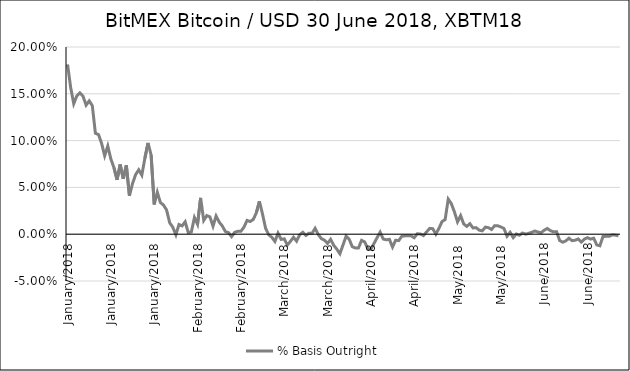
| Category | % Basis Outright |
|---|---|
| 2018-06-30 | -0.002 |
| 2018-06-29 | -0.001 |
| 2018-06-28 | -0.001 |
| 2018-06-27 | -0.002 |
| 2018-06-26 | -0.002 |
| 2018-06-25 | -0.002 |
| 2018-06-24 | -0.012 |
| 2018-06-23 | -0.012 |
| 2018-06-22 | -0.004 |
| 2018-06-21 | -0.005 |
| 2018-06-20 | -0.004 |
| 2018-06-19 | -0.005 |
| 2018-06-18 | -0.008 |
| 2018-06-17 | -0.005 |
| 2018-06-16 | -0.006 |
| 2018-06-15 | -0.007 |
| 2018-06-14 | -0.004 |
| 2018-06-13 | -0.007 |
| 2018-06-12 | -0.009 |
| 2018-06-11 | -0.007 |
| 2018-06-10 | 0.003 |
| 2018-06-09 | 0.002 |
| 2018-06-08 | 0.004 |
| 2018-06-07 | 0.006 |
| 2018-06-06 | 0.004 |
| 2018-06-05 | 0.002 |
| 2018-06-04 | 0.002 |
| 2018-06-03 | 0.003 |
| 2018-06-02 | 0.002 |
| 2018-06-01 | 0.001 |
| 2018-05-31 | 0 |
| 2018-05-30 | 0.001 |
| 2018-05-29 | -0.001 |
| 2018-05-28 | 0 |
| 2018-05-27 | -0.004 |
| 2018-05-26 | 0.002 |
| 2018-05-25 | -0.002 |
| 2018-05-24 | 0.006 |
| 2018-05-23 | 0.008 |
| 2018-05-22 | 0.009 |
| 2018-05-21 | 0.009 |
| 2018-05-20 | 0.005 |
| 2018-05-19 | 0.007 |
| 2018-05-18 | 0.008 |
| 2018-05-17 | 0.004 |
| 2018-05-16 | 0.004 |
| 2018-05-15 | 0.007 |
| 2018-05-14 | 0.007 |
| 2018-05-13 | 0.011 |
| 2018-05-12 | 0.008 |
| 2018-05-11 | 0.011 |
| 2018-05-10 | 0.02 |
| 2018-05-09 | 0.013 |
| 2018-05-08 | 0.024 |
| 2018-05-07 | 0.033 |
| 2018-05-06 | 0.037 |
| 2018-05-05 | 0.016 |
| 2018-05-04 | 0.014 |
| 2018-05-03 | 0.006 |
| 2018-05-02 | 0 |
| 2018-05-01 | 0.006 |
| 2018-04-30 | 0.006 |
| 2018-04-29 | 0.002 |
| 2018-04-28 | -0.001 |
| 2018-04-27 | 0 |
| 2018-04-26 | 0 |
| 2018-04-25 | -0.004 |
| 2018-04-24 | -0.002 |
| 2018-04-23 | -0.002 |
| 2018-04-22 | -0.002 |
| 2018-04-21 | -0.002 |
| 2018-04-20 | -0.007 |
| 2018-04-19 | -0.006 |
| 2018-04-18 | -0.014 |
| 2018-04-17 | -0.006 |
| 2018-04-16 | -0.006 |
| 2018-04-15 | -0.005 |
| 2018-04-14 | 0.002 |
| 2018-04-13 | -0.004 |
| 2018-04-12 | -0.01 |
| 2018-04-11 | -0.016 |
| 2018-04-10 | -0.015 |
| 2018-04-09 | -0.008 |
| 2018-04-08 | -0.007 |
| 2018-04-07 | -0.015 |
| 2018-04-06 | -0.015 |
| 2018-04-05 | -0.013 |
| 2018-04-04 | -0.005 |
| 2018-04-03 | -0.002 |
| 2018-04-02 | -0.012 |
| 2018-04-01 | -0.021 |
| 2018-03-31 | -0.016 |
| 2018-03-30 | -0.012 |
| 2018-03-29 | -0.005 |
| 2018-03-28 | -0.01 |
| 2018-03-27 | -0.006 |
| 2018-03-26 | -0.005 |
| 2018-03-25 | 0 |
| 2018-03-24 | 0.006 |
| 2018-03-23 | 0.001 |
| 2018-03-22 | 0.001 |
| 2018-03-21 | -0.001 |
| 2018-03-20 | 0.002 |
| 2018-03-19 | -0.001 |
| 2018-03-18 | -0.007 |
| 2018-03-17 | -0.003 |
| 2018-03-16 | -0.008 |
| 2018-03-15 | -0.012 |
| 2018-03-14 | -0.005 |
| 2018-03-13 | -0.006 |
| 2018-03-12 | 0.001 |
| 2018-03-11 | -0.008 |
| 2018-03-10 | -0.003 |
| 2018-03-09 | -0.001 |
| 2018-03-08 | 0.006 |
| 2018-03-07 | 0.021 |
| 2018-03-06 | 0.035 |
| 2018-03-05 | 0.023 |
| 2018-03-04 | 0.016 |
| 2018-03-03 | 0.014 |
| 2018-03-02 | 0.015 |
| 2018-03-01 | 0.008 |
| 2018-02-28 | 0.003 |
| 2018-02-27 | 0.003 |
| 2018-02-26 | 0.002 |
| 2018-02-25 | -0.003 |
| 2018-02-24 | 0.002 |
| 2018-02-23 | 0.003 |
| 2018-02-22 | 0.009 |
| 2018-02-21 | 0.013 |
| 2018-02-20 | 0.019 |
| 2018-02-19 | 0.009 |
| 2018-02-18 | 0.019 |
| 2018-02-17 | 0.02 |
| 2018-02-16 | 0.015 |
| 2018-02-15 | 0.039 |
| 2018-02-14 | 0.011 |
| 2018-02-13 | 0.018 |
| 2018-02-12 | 0.002 |
| 2018-02-11 | 0.002 |
| 2018-02-10 | 0.013 |
| 2018-02-09 | 0.009 |
| 2018-02-08 | 0.01 |
| 2018-02-07 | -0.001 |
| 2018-02-06 | 0.007 |
| 2018-02-05 | 0.012 |
| 2018-02-04 | 0.026 |
| 2018-02-03 | 0.031 |
| 2018-02-02 | 0.034 |
| 2018-02-01 | 0.045 |
| 2018-01-31 | 0.032 |
| 2018-01-30 | 0.085 |
| 2018-01-29 | 0.097 |
| 2018-01-28 | 0.081 |
| 2018-01-27 | 0.063 |
| 2018-01-26 | 0.069 |
| 2018-01-25 | 0.064 |
| 2018-01-24 | 0.054 |
| 2018-01-23 | 0.041 |
| 2018-01-22 | 0.074 |
| 2018-01-21 | 0.059 |
| 2018-01-20 | 0.075 |
| 2018-01-19 | 0.058 |
| 2018-01-18 | 0.071 |
| 2018-01-17 | 0.08 |
| 2018-01-16 | 0.094 |
| 2018-01-15 | 0.084 |
| 2018-01-14 | 0.097 |
| 2018-01-13 | 0.106 |
| 2018-01-12 | 0.108 |
| 2018-01-11 | 0.137 |
| 2018-01-10 | 0.142 |
| 2018-01-09 | 0.138 |
| 2018-01-08 | 0.147 |
| 2018-01-07 | 0.151 |
| 2018-01-06 | 0.148 |
| 2018-01-05 | 0.139 |
| 2018-01-04 | 0.157 |
| 2018-01-03 | 0.181 |